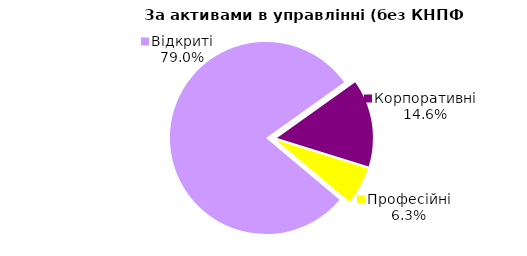
| Category | Series 0 |
|---|---|
| Відкриті | 2092.682 |
| Корпоративні | 387.713 |
| Професійні | 167.23 |